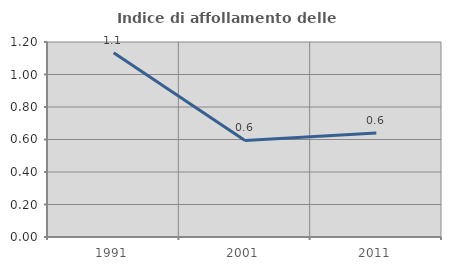
| Category | Indice di affollamento delle abitazioni  |
|---|---|
| 1991.0 | 1.134 |
| 2001.0 | 0.594 |
| 2011.0 | 0.64 |